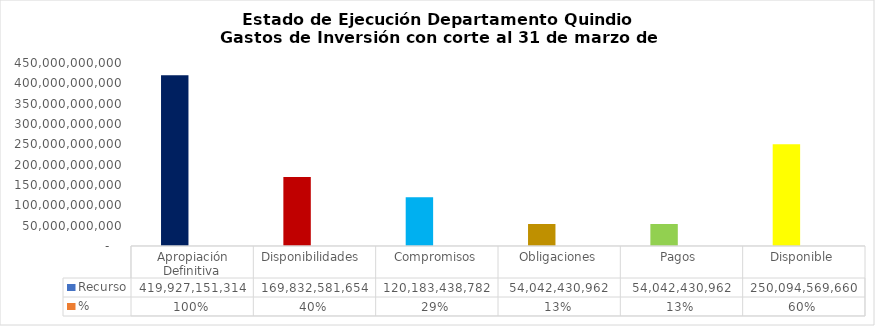
| Category | Recurso  | % |
|---|---|---|
| Apropiación Definitiva | 419927151314.09 | 1 |
| Disponibilidades  | 169832581654.24 | 0.404 |
| Compromisos | 120183438781.91 | 0.286 |
| Obligaciones | 54042430962.4 | 0.129 |
| Pagos  | 54042430962.4 | 0.129 |
| Disponible | 250094569659.85 | 0.596 |